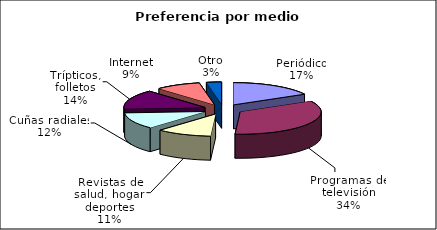
| Category | Series 0 |
|---|---|
| Periódico | 0.17 |
| Programas de televisión | 0.34 |
| Revistas de salud, hogar, deportes | 0.11 |
| Cuñas radiales | 0.12 |
| Trípticos, folletos | 0.14 |
| Internet | 0.09 |
| Otro | 0.03 |